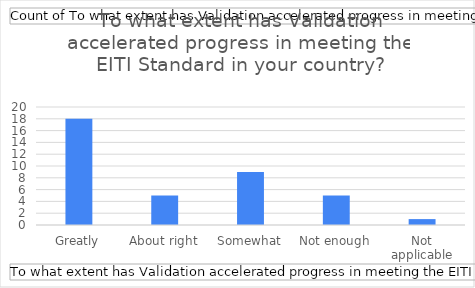
| Category | Total |
|---|---|
| Greatly | 18 |
| About right | 5 |
| Somewhat | 9 |
| Not enough | 5 |
| Not applicable | 1 |